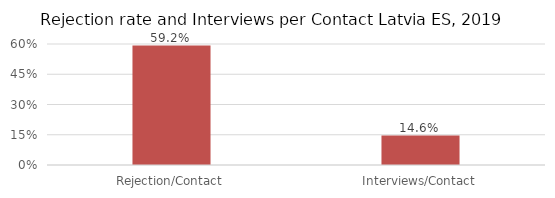
| Category | Series 0 |
|---|---|
| Rejection/Contact | 0.592 |
| Interviews/Contact | 0.146 |